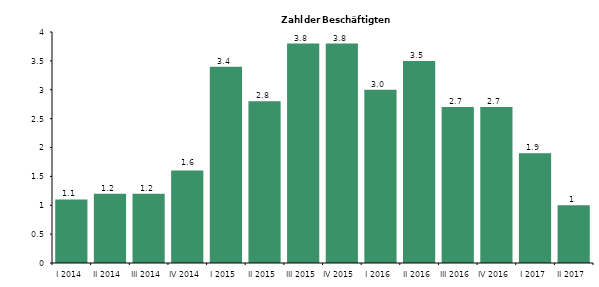
| Category | 1,1 1,2 1,2 1,6 3,4 2,8 3,8 3,8 3,0 3,5 2,7 2,7 1,9 1 |
|---|---|
| I 2014 | 1.1 |
| II 2014 | 1.2 |
| III 2014 | 1.2 |
| IV 2014 | 1.6 |
| I 2015 | 3.4 |
| II 2015 | 2.8 |
| III 2015 | 3.8 |
| IV 2015 | 3.8 |
| I 2016 | 3 |
| II 2016 | 3.5 |
| III 2016 | 2.7 |
| IV 2016 | 2.7 |
| I 2017 | 1.9 |
| II 2017 | 1 |